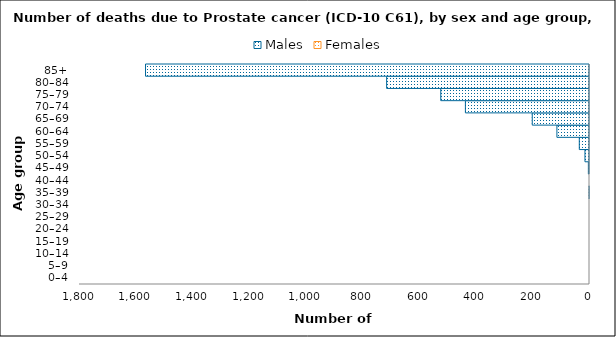
| Category | Males | Females |
|---|---|---|
| 0–4 | 0 | 0 |
| 5–9 | 0 | 0 |
| 10–14 | 0 | 0 |
| 15–19 | 0 | 0 |
| 20–24 | 0 | 0 |
| 25–29 | 0 | 0 |
| 30–34 | 0 | 0 |
| 35–39 | -1 | 0 |
| 40–44 | 0 | 0 |
| 45–49 | -4 | 0 |
| 50–54 | -16 | 0 |
| 55–59 | -36 | 0 |
| 60–64 | -115 | 0 |
| 65–69 | -202 | 0 |
| 70–74 | -438 | 0 |
| 75–79 | -525 | 0 |
| 80–84 | -716 | 0 |
| 85+ | -1567 | 0 |